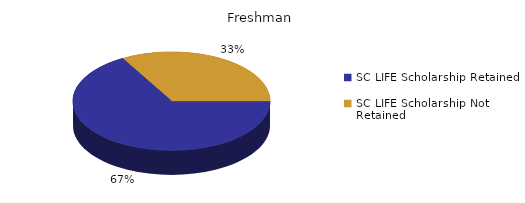
| Category | Freshman |
|---|---|
| SC LIFE Scholarship Retained  | 1389 |
| SC LIFE Scholarship Not Retained  | 693 |